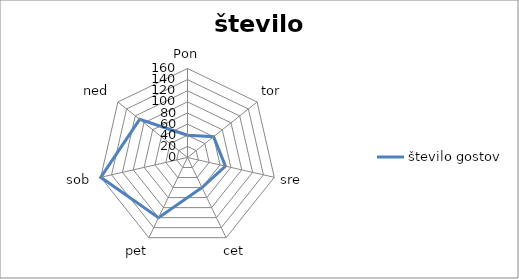
| Category | število gostov |
|---|---|
| Pon | 40 |
| tor | 60 |
| sre | 70 |
| cet | 60 |
| pet | 120 |
| sob | 160 |
| ned | 110 |